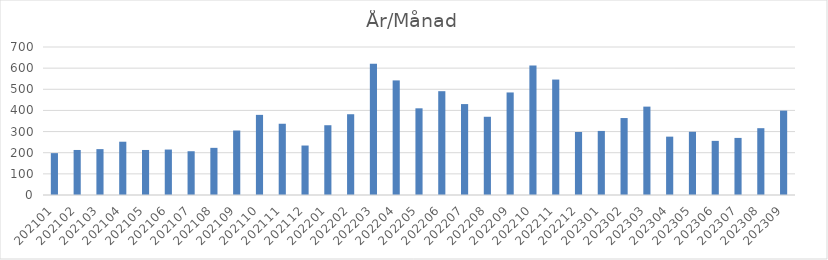
| Category | Summa |
|---|---|
| 202101 | 198 |
| 202102 | 213 |
| 202103 | 217 |
| 202104 | 252 |
| 202105 | 213 |
| 202106 | 215 |
| 202107 | 207 |
| 202108 | 223 |
| 202109 | 305 |
| 202110 | 379 |
| 202111 | 337 |
| 202112 | 234 |
| 202201 | 330 |
| 202202 | 382 |
| 202203 | 621 |
| 202204 | 542 |
| 202205 | 410 |
| 202206 | 491 |
| 202207 | 430 |
| 202208 | 370 |
| 202209 | 485 |
| 202210 | 612 |
| 202211 | 546 |
| 202212 | 298 |
| 202301 | 303 |
| 202302 | 364 |
| 202303 | 418 |
| 202304 | 276 |
| 202305 | 299 |
| 202306 | 256 |
| 202307 | 270 |
| 202308 | 316 |
| 202309 | 399 |